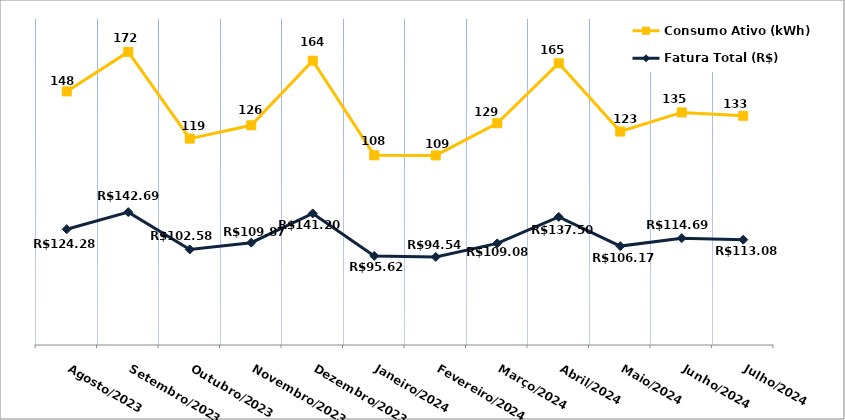
| Category | Fatura Total (R$) | Consumo Ativo (kWh) |
|---|---|---|
| Agosto/2023 | 124.28 | 148 |
| Setembro/2023 | 142.69 | 172 |
| Outubro/2023 | 102.58 | 119 |
| Novembro/2023 | 109.87 | 126 |
| Dezembro/2023 | 141.2 | 164 |
| Janeiro/2024 | 95.62 | 108 |
| Fevereiro/2024 | 94.54 | 109 |
| Março/2024 | 109.08 | 129 |
| Abril/2024 | 137.5 | 165 |
| Maio/2024 | 106.17 | 123 |
| Junho/2024 | 114.69 | 135 |
| Julho/2024 | 113.08 | 133 |